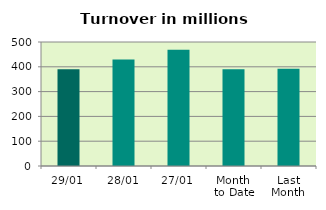
| Category | Series 0 |
|---|---|
| 29/01 | 389.754 |
| 28/01 | 429.681 |
| 27/01 | 469.229 |
| Month 
to Date | 390.141 |
| Last
Month | 391.769 |